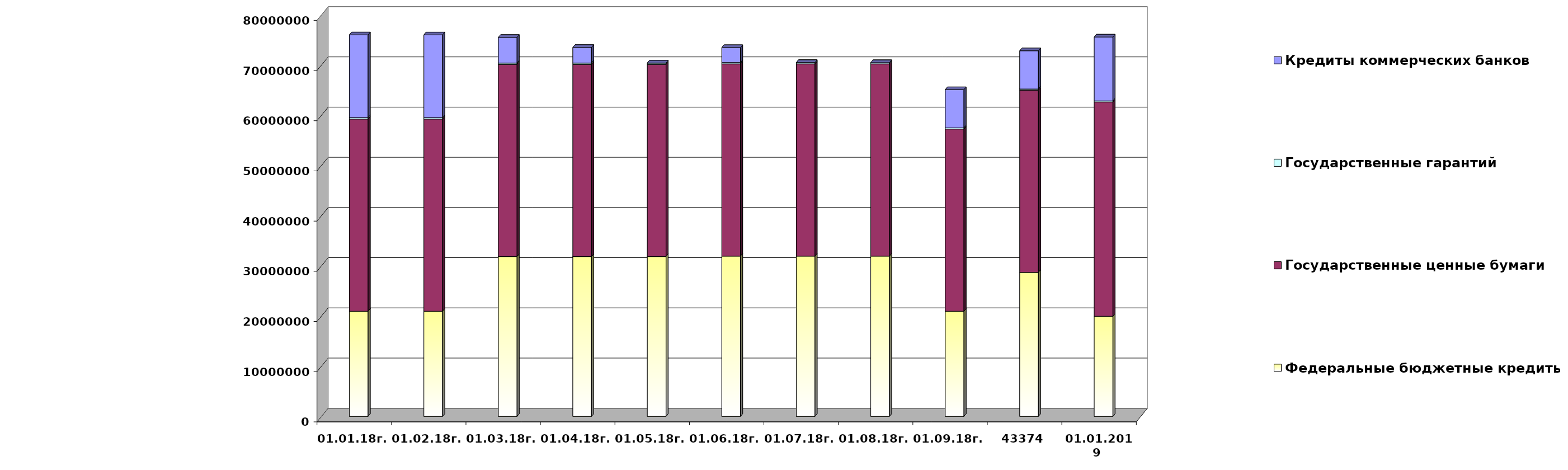
| Category | Федеральные бюджетные кредиты | Государственные ценные бумаги  | Государственные гарантий | Кредиты коммерческих банков |
|---|---|---|---|---|
| 01.01.18г. | 20959084.963 | 38300000 | 267412.82 | 16500000 |
| 01.02.18г. | 20959084.963 | 38300000 | 262100.52 | 16500000 |
| 01.03.18г. | 31846902.963 | 38300000 | 262100.52 | 5112182 |
| 01.04.18г. | 31846902.963 | 38300000 | 262100.52 | 3112182 |
| 01.05.18г. | 31846902.963 | 38300000 | 253223.16 | 0 |
| 01.06.18г. | 31945227.963 | 38300000 | 253223.16 | 3000000 |
| 01.07.18г. | 31945227.963 | 38300000 | 253223.16 | 0 |
| 01.08.18г. | 31945227.963 | 38300000 | 232477.01 | 0 |
| 01.09.18г. | 20959084.963 | 36300000 | 232477.01 | 7612182 |
| 43374 | 28702553.563 | 36300000 | 232477.01 | 7612182 |
| 01.01.2019 
(прогноз) | 19957026.2 | 42700000 | 209872.8 | 12725037.2 |